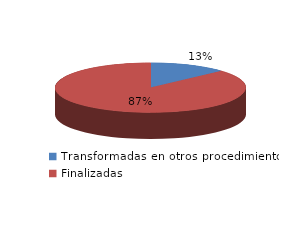
| Category | Series 0 |
|---|---|
| Transformadas en otros procedimientos | 5602 |
| Finalizadas | 37151 |